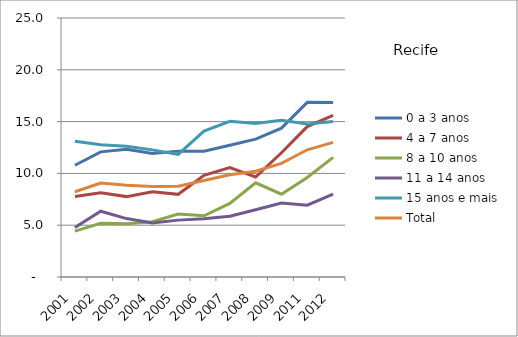
| Category | 0 a 3 anos | 4 a 7 anos | 8 a 10 anos | 11 a 14 anos | 15 anos e mais | Total |
|---|---|---|---|---|---|---|
| 2001.0 | 10.79 | 7.77 | 4.43 | 4.78 | 13.1 | 8.23 |
| 2002.0 | 12.08 | 8.13 | 5.18 | 6.35 | 12.76 | 9.07 |
| 2003.0 | 12.33 | 7.76 | 5.15 | 5.64 | 12.62 | 8.85 |
| 2004.0 | 11.93 | 8.23 | 5.34 | 5.21 | 12.27 | 8.74 |
| 2005.0 | 12.15 | 7.98 | 6.07 | 5.49 | 11.83 | 8.77 |
| 2006.0 | 12.14 | 9.82 | 5.91 | 5.63 | 14.08 | 9.31 |
| 2007.0 | 12.72 | 10.56 | 7.1 | 5.86 | 15.03 | 9.86 |
| 2008.0 | 13.31 | 9.65 | 9.09 | 6.49 | 14.81 | 10.21 |
| 2009.0 | 14.37 | 11.99 | 7.99 | 7.15 | 15.12 | 10.97 |
| 2011.0 | 16.86 | 14.52 | 9.61 | 6.93 | 14.77 | 12.28 |
| 2012.0 | 16.84 | 15.61 | 11.55 | 7.99 | 15.01 | 13 |